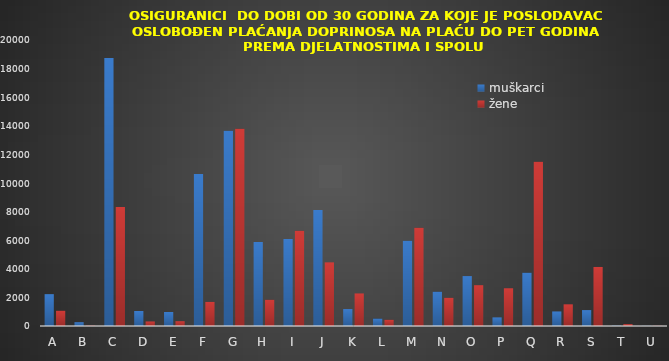
| Category | muškarci | žene |
|---|---|---|
| A | 2228 | 1070 |
| B | 267 | 29 |
| C | 18733 | 8314 |
| D | 1049 | 317 |
| E | 979 | 335 |
| F | 10629 | 1686 |
| G | 13648 | 13792 |
| H | 5873 | 1836 |
| I | 6083 | 6659 |
| J | 8114 | 4451 |
| K | 1185 | 2277 |
| L | 523 | 436 |
| M | 5970 | 6878 |
| N | 2401 | 1974 |
| O | 3491 | 2854 |
| P | 602 | 2639 |
| Q | 3727 | 11485 |
| R | 1018 | 1516 |
| S | 1113 | 4129 |
| T | 23 | 132 |
| U | 11 | 13 |